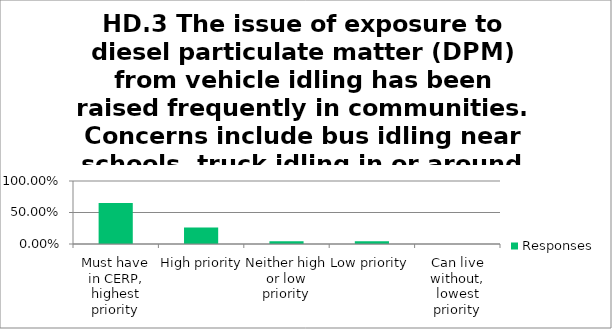
| Category | Responses |
|---|---|
| Must have in CERP, highest priority | 0.652 |
| High priority | 0.261 |
| Neither high or low priority | 0.044 |
| Low priority | 0.044 |
| Can live without, lowest priority | 0 |